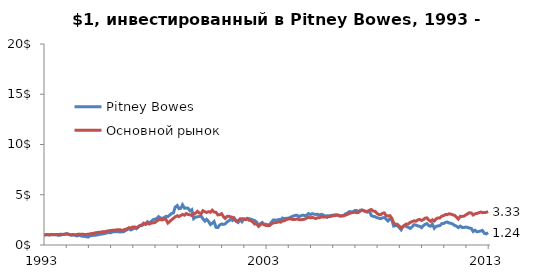
| Category | Pitney Bowes | Основной рынок |
|---|---|---|
| 1993-01-04 | 1 | 1 |
| 1993-02-01 | 1.018 | 1.01 |
| 1993-03-01 | 1.043 | 1.029 |
| 1993-04-01 | 1.002 | 1.003 |
| 1993-05-03 | 1.057 | 1.026 |
| 1993-06-01 | 1.032 | 1.027 |
| 1993-07-01 | 1.035 | 1.021 |
| 1993-08-02 | 1.016 | 1.056 |
| 1993-09-01 | 0.956 | 1.046 |
| 1993-10-01 | 0.981 | 1.066 |
| 1993-11-01 | 1.056 | 1.052 |
| 1993-12-01 | 1.041 | 1.063 |
| 1994-01-03 | 1.128 | 1.098 |
| 1994-02-01 | 1.109 | 1.065 |
| 1994-03-01 | 1.027 | 1.016 |
| 1994-04-04 | 0.974 | 1.028 |
| 1994-05-02 | 0.996 | 1.04 |
| 1994-06-01 | 0.971 | 1.013 |
| 1994-07-01 | 0.898 | 1.044 |
| 1994-08-01 | 0.987 | 1.084 |
| 1994-09-01 | 0.91 | 1.055 |
| 1994-10-03 | 0.865 | 1.077 |
| 1994-11-01 | 0.859 | 1.034 |
| 1994-12-01 | 0.821 | 1.047 |
| 1995-01-03 | 0.798 | 1.072 |
| 1995-02-01 | 0.925 | 1.111 |
| 1995-03-01 | 0.938 | 1.141 |
| 1995-04-03 | 0.968 | 1.173 |
| 1995-05-01 | 0.976 | 1.216 |
| 1995-06-01 | 1.005 | 1.242 |
| 1995-07-03 | 1.054 | 1.281 |
| 1995-08-01 | 1.076 | 1.281 |
| 1995-09-01 | 1.112 | 1.332 |
| 1995-10-02 | 1.155 | 1.325 |
| 1995-11-01 | 1.193 | 1.38 |
| 1995-12-01 | 1.252 | 1.404 |
| 1996-01-02 | 1.206 | 1.45 |
| 1996-02-01 | 1.295 | 1.46 |
| 1996-03-01 | 1.315 | 1.471 |
| 1996-04-01 | 1.309 | 1.491 |
| 1996-05-01 | 1.341 | 1.525 |
| 1996-06-03 | 1.29 | 1.528 |
| 1996-07-01 | 1.311 | 1.458 |
| 1996-08-01 | 1.313 | 1.486 |
| 1996-09-03 | 1.435 | 1.566 |
| 1996-10-01 | 1.52 | 1.607 |
| 1996-11-01 | 1.615 | 1.725 |
| 1996-12-02 | 1.498 | 1.688 |
| 1997-01-02 | 1.578 | 1.792 |
| 1997-02-03 | 1.711 | 1.802 |
| 1997-03-03 | 1.618 | 1.726 |
| 1997-04-01 | 1.763 | 1.826 |
| 1997-05-01 | 1.947 | 1.933 |
| 1997-06-02 | 1.926 | 2.017 |
| 1997-07-01 | 2.081 | 2.175 |
| 1997-08-01 | 2.127 | 2.05 |
| 1997-09-02 | 2.317 | 2.159 |
| 1997-10-01 | 2.209 | 2.084 |
| 1997-11-03 | 2.352 | 2.177 |
| 1997-12-01 | 2.517 | 2.212 |
| 1998-01-02 | 2.568 | 2.234 |
| 1998-02-02 | 2.637 | 2.391 |
| 1998-03-02 | 2.823 | 2.511 |
| 1998-04-01 | 2.7 | 2.534 |
| 1998-05-01 | 2.656 | 2.486 |
| 1998-06-01 | 2.719 | 2.584 |
| 1998-07-01 | 2.854 | 2.554 |
| 1998-08-03 | 2.816 | 2.182 |
| 1998-09-01 | 2.982 | 2.318 |
| 1998-10-01 | 3.125 | 2.504 |
| 1998-11-02 | 3.191 | 2.652 |
| 1998-12-01 | 3.763 | 2.801 |
| 1999-01-04 | 3.921 | 2.916 |
| 1999-02-01 | 3.613 | 2.822 |
| 1999-03-01 | 3.645 | 2.932 |
| 1999-04-01 | 3.999 | 3.043 |
| 1999-05-03 | 3.659 | 2.967 |
| 1999-06-01 | 3.688 | 3.128 |
| 1999-07-01 | 3.653 | 3.028 |
| 1999-08-02 | 3.401 | 3.009 |
| 1999-09-01 | 3.514 | 2.923 |
| 1999-10-01 | 2.627 | 3.106 |
| 1999-11-01 | 2.779 | 3.165 |
| 1999-12-01 | 2.801 | 3.348 |
| 2000-01-03 | 2.84 | 3.178 |
| 2000-02-01 | 2.885 | 3.114 |
| 2000-03-01 | 2.605 | 3.415 |
| 2000-04-03 | 2.383 | 3.31 |
| 2000-05-01 | 2.555 | 3.238 |
| 2000-06-01 | 2.349 | 3.315 |
| 2000-07-03 | 2.033 | 3.261 |
| 2000-08-01 | 2.166 | 3.459 |
| 2000-09-01 | 2.335 | 3.274 |
| 2000-10-02 | 1.758 | 3.258 |
| 2000-11-01 | 1.738 | 2.997 |
| 2000-12-01 | 1.981 | 3.009 |
| 2001-01-02 | 2.091 | 3.113 |
| 2001-02-01 | 2.053 | 2.826 |
| 2001-03-01 | 2.096 | 2.644 |
| 2001-04-02 | 2.296 | 2.848 |
| 2001-05-01 | 2.401 | 2.862 |
| 2001-06-01 | 2.559 | 2.79 |
| 2001-07-02 | 2.442 | 2.76 |
| 2001-08-01 | 2.66 | 2.583 |
| 2001-09-04 | 2.336 | 2.372 |
| 2001-10-01 | 2.242 | 2.415 |
| 2001-11-01 | 2.537 | 2.597 |
| 2001-12-03 | 2.316 | 2.617 |
| 2002-01-02 | 2.576 | 2.576 |
| 2002-02-04 | 2.588 | 2.522 |
| 2002-03-01 | 2.656 | 2.615 |
| 2002-04-01 | 2.612 | 2.454 |
| 2002-05-01 | 2.559 | 2.432 |
| 2002-06-03 | 2.482 | 2.256 |
| 2002-07-01 | 2.437 | 2.078 |
| 2002-08-01 | 2.283 | 2.088 |
| 2002-09-03 | 1.92 | 1.858 |
| 2002-10-01 | 2.113 | 2.019 |
| 2002-11-01 | 2.243 | 2.134 |
| 2002-12-02 | 2.075 | 2.005 |
| 2003-01-02 | 2.068 | 1.95 |
| 2003-02-03 | 1.991 | 1.917 |
| 2003-03-03 | 2.047 | 1.933 |
| 2003-04-01 | 2.251 | 2.09 |
| 2003-05-01 | 2.484 | 2.196 |
| 2003-06-02 | 2.484 | 2.221 |
| 2003-07-01 | 2.464 | 2.257 |
| 2003-08-01 | 2.541 | 2.297 |
| 2003-09-02 | 2.497 | 2.27 |
| 2003-10-01 | 2.679 | 2.395 |
| 2003-11-03 | 2.61 | 2.412 |
| 2003-12-01 | 2.667 | 2.534 |
| 2004-01-02 | 2.664 | 2.578 |
| 2004-02-02 | 2.735 | 2.609 |
| 2004-03-01 | 2.819 | 2.567 |
| 2004-04-01 | 2.894 | 2.524 |
| 2004-05-03 | 2.953 | 2.554 |
| 2004-06-01 | 2.948 | 2.6 |
| 2004-07-01 | 2.811 | 2.511 |
| 2004-08-02 | 2.923 | 2.517 |
| 2004-09-01 | 2.959 | 2.54 |
| 2004-10-01 | 2.935 | 2.576 |
| 2004-11-01 | 2.957 | 2.675 |
| 2004-12-01 | 3.127 | 2.762 |
| 2005-01-03 | 3.023 | 2.692 |
| 2005-02-01 | 3.119 | 2.743 |
| 2005-03-01 | 3.069 | 2.691 |
| 2005-04-01 | 3.042 | 2.637 |
| 2005-05-02 | 3.055 | 2.715 |
| 2005-06-01 | 2.982 | 2.715 |
| 2005-07-01 | 3.053 | 2.813 |
| 2005-08-01 | 2.982 | 2.781 |
| 2005-09-01 | 2.879 | 2.801 |
| 2005-10-03 | 2.902 | 2.751 |
| 2005-11-01 | 2.895 | 2.848 |
| 2005-12-01 | 2.936 | 2.845 |
| 2006-01-03 | 2.97 | 2.917 |
| 2006-02-01 | 2.993 | 2.919 |
| 2006-03-01 | 3.005 | 2.951 |
| 2006-04-03 | 2.93 | 2.987 |
| 2006-05-01 | 2.877 | 2.895 |
| 2006-06-01 | 2.913 | 2.895 |
| 2006-07-03 | 2.914 | 2.91 |
| 2006-08-01 | 3.098 | 2.971 |
| 2006-09-01 | 3.153 | 3.044 |
| 2006-10-02 | 3.32 | 3.14 |
| 2006-11-01 | 3.298 | 3.192 |
| 2006-12-01 | 3.306 | 3.232 |
| 2007-01-03 | 3.425 | 3.278 |
| 2007-02-01 | 3.438 | 3.206 |
| 2007-03-01 | 3.27 | 3.238 |
| 2007-04-02 | 3.459 | 3.378 |
| 2007-05-01 | 3.465 | 3.488 |
| 2007-06-01 | 3.397 | 3.426 |
| 2007-07-02 | 3.345 | 3.317 |
| 2007-08-01 | 3.265 | 3.359 |
| 2007-09-04 | 3.32 | 3.48 |
| 2007-10-01 | 2.927 | 3.531 |
| 2007-11-01 | 2.848 | 3.376 |
| 2007-12-03 | 2.813 | 3.346 |
| 2008-01-02 | 2.714 | 3.142 |
| 2008-02-01 | 2.672 | 3.033 |
| 2008-03-03 | 2.615 | 3.014 |
| 2008-04-01 | 2.697 | 3.158 |
| 2008-05-01 | 2.737 | 3.192 |
| 2008-06-02 | 2.57 | 2.917 |
| 2008-07-01 | 2.389 | 2.888 |
| 2008-08-01 | 2.6 | 2.924 |
| 2008-09-02 | 2.532 | 2.658 |
| 2008-10-01 | 1.886 | 2.208 |
| 2008-11-03 | 1.909 | 2.043 |
| 2008-12-01 | 1.969 | 2.059 |
| 2009-01-02 | 1.719 | 1.882 |
| 2009-02-02 | 1.515 | 1.675 |
| 2009-03-02 | 1.834 | 1.818 |
| 2009-04-01 | 1.927 | 1.989 |
| 2009-05-01 | 1.827 | 2.095 |
| 2009-06-01 | 1.752 | 2.095 |
| 2009-07-01 | 1.649 | 2.251 |
| 2009-08-03 | 1.814 | 2.326 |
| 2009-09-01 | 2.017 | 2.409 |
| 2009-10-01 | 1.989 | 2.362 |
| 2009-11-02 | 1.898 | 2.497 |
| 2009-12-01 | 1.874 | 2.541 |
| 2010-01-04 | 1.723 | 2.447 |
| 2010-02-01 | 1.917 | 2.517 |
| 2010-03-01 | 2.046 | 2.665 |
| 2010-04-01 | 2.125 | 2.705 |
| 2010-05-03 | 1.923 | 2.483 |
| 2010-06-01 | 1.865 | 2.349 |
| 2010-07-01 | 2.073 | 2.511 |
| 2010-08-02 | 1.663 | 2.391 |
| 2010-09-01 | 1.849 | 2.601 |
| 2010-10-01 | 1.897 | 2.697 |
| 2010-11-01 | 1.927 | 2.691 |
| 2010-12-01 | 2.124 | 2.866 |
| 2011-01-03 | 2.133 | 2.931 |
| 2011-02-01 | 2.244 | 3.025 |
| 2011-03-01 | 2.29 | 3.022 |
| 2011-04-01 | 2.189 | 3.108 |
| 2011-05-02 | 2.162 | 3.066 |
| 2011-06-01 | 2.08 | 3.01 |
| 2011-07-01 | 1.95 | 2.945 |
| 2011-08-01 | 1.873 | 2.778 |
| 2011-09-01 | 1.734 | 2.579 |
| 2011-10-03 | 1.88 | 2.856 |
| 2011-11-01 | 1.752 | 2.842 |
| 2011-12-01 | 1.743 | 2.866 |
| 2012-01-03 | 1.784 | 2.991 |
| 2012-02-01 | 1.74 | 3.112 |
| 2012-03-01 | 1.687 | 3.21 |
| 2012-04-02 | 1.644 | 3.186 |
| 2012-05-01 | 1.34 | 2.986 |
| 2012-06-01 | 1.471 | 3.104 |
| 2012-07-02 | 1.313 | 3.144 |
| 2012-08-01 | 1.348 | 3.206 |
| 2012-09-04 | 1.395 | 3.283 |
| 2012-10-01 | 1.449 | 3.218 |
| 2012-11-01 | 1.167 | 3.228 |
| 2012-12-03 | 1.109 | 3.25 |
| 2013-01-02 | 1.239 | 3.33 |